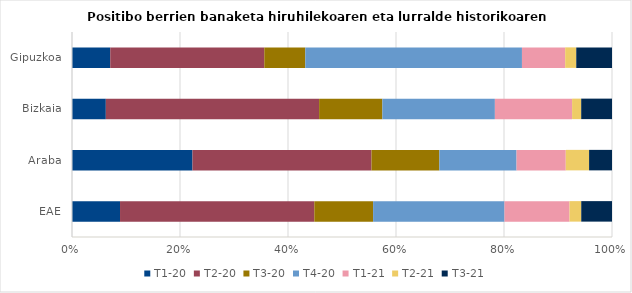
| Category | T1-20 | T2-20 | T3-20 | T4-20 | T1-21 | T2-21 | T3-21 |
|---|---|---|---|---|---|---|---|
| EAE | 8.893 | 35.979 | 10.887 | 24.329 | 12.045 | 2.173 | 5.694 |
| Araba | 22.31 | 33.15 | 12.569 | 14.297 | 9.112 | 4.321 | 4.242 |
| Bizkaia | 6.266 | 39.496 | 11.717 | 20.834 | 14.297 | 1.688 | 5.703 |
| Gipuzkoa | 7.081 | 28.527 | 7.594 | 40.123 | 8.004 | 2.052 | 6.619 |